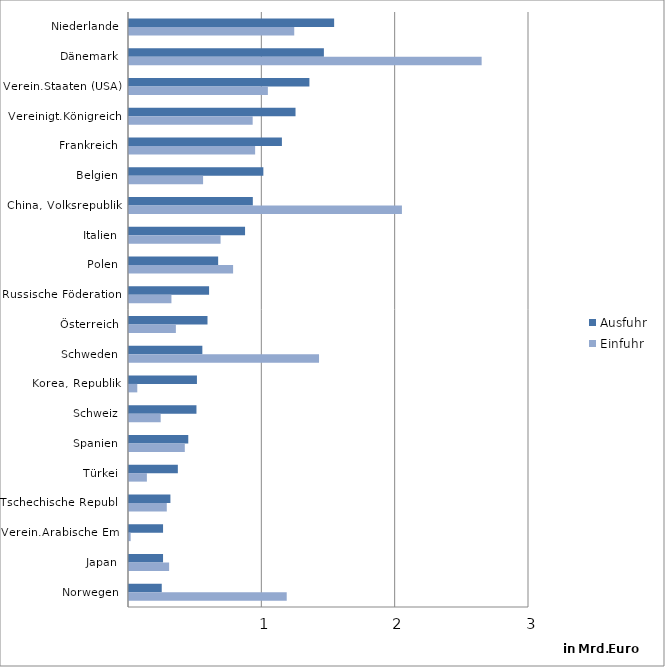
| Category | Ausfuhr | Einfuhr |
|---|---|---|
| Niederlande | 1.539 | 1.239 |
| Dänemark | 1.462 | 2.645 |
| Verein.Staaten (USA) | 1.353 | 1.042 |
| Vereinigt.Königreich | 1.249 | 0.928 |
| Frankreich | 1.147 | 0.946 |
| Belgien | 1.008 | 0.556 |
| China, Volksrepublik | 0.929 | 2.047 |
| Italien | 0.87 | 0.687 |
| Polen | 0.669 | 0.781 |
| Russische Föderation | 0.601 | 0.318 |
| Österreich | 0.589 | 0.352 |
| Schweden | 0.55 | 1.425 |
| Korea, Republik | 0.51 | 0.062 |
| Schweiz | 0.506 | 0.238 |
| Spanien | 0.445 | 0.418 |
| Türkei | 0.366 | 0.134 |
| Tschechische Republ. | 0.311 | 0.283 |
| Verein.Arabische Em. | 0.255 | 0.012 |
| Japan | 0.255 | 0.301 |
| Norwegen | 0.246 | 1.183 |